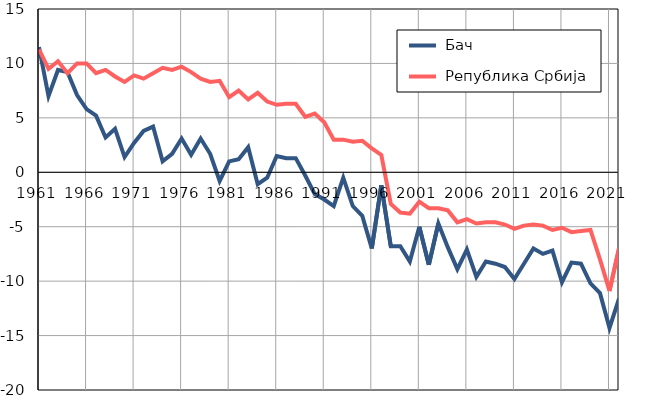
| Category |  Бач |  Република Србија |
|---|---|---|
| 1961.0 | 11.5 | 11.3 |
| 1962.0 | 7 | 9.5 |
| 1963.0 | 9.4 | 10.2 |
| 1964.0 | 9.2 | 9.1 |
| 1965.0 | 7.1 | 10 |
| 1966.0 | 5.8 | 10 |
| 1967.0 | 5.2 | 9.1 |
| 1968.0 | 3.2 | 9.4 |
| 1969.0 | 4 | 8.8 |
| 1970.0 | 1.4 | 8.3 |
| 1971.0 | 2.7 | 8.9 |
| 1972.0 | 3.8 | 8.6 |
| 1973.0 | 4.2 | 9.1 |
| 1974.0 | 1 | 9.6 |
| 1975.0 | 1.7 | 9.4 |
| 1976.0 | 3.1 | 9.7 |
| 1977.0 | 1.6 | 9.2 |
| 1978.0 | 3.1 | 8.6 |
| 1979.0 | 1.7 | 8.3 |
| 1980.0 | -0.8 | 8.4 |
| 1981.0 | 1 | 6.9 |
| 1982.0 | 1.2 | 7.5 |
| 1983.0 | 2.3 | 6.7 |
| 1984.0 | -1.1 | 7.3 |
| 1985.0 | -0.5 | 6.5 |
| 1986.0 | 1.5 | 6.2 |
| 1987.0 | 1.3 | 6.3 |
| 1988.0 | 1.3 | 6.3 |
| 1989.0 | -0.3 | 5.1 |
| 1990.0 | -2 | 5.4 |
| 1991.0 | -2.5 | 4.6 |
| 1992.0 | -3.1 | 3 |
| 1993.0 | -0.5 | 3 |
| 1994.0 | -3.1 | 2.8 |
| 1995.0 | -4 | 2.9 |
| 1996.0 | -7 | 2.2 |
| 1997.0 | -1.2 | 1.6 |
| 1998.0 | -6.8 | -2.9 |
| 1999.0 | -6.8 | -3.7 |
| 2000.0 | -8.2 | -3.8 |
| 2001.0 | -5 | -2.7 |
| 2002.0 | -8.5 | -3.3 |
| 2003.0 | -4.7 | -3.3 |
| 2004.0 | -6.9 | -3.5 |
| 2005.0 | -8.9 | -4.6 |
| 2006.0 | -7.1 | -4.3 |
| 2007.0 | -9.6 | -4.7 |
| 2008.0 | -8.2 | -4.6 |
| 2009.0 | -8.4 | -4.6 |
| 2010.0 | -8.7 | -4.8 |
| 2011.0 | -9.8 | -5.2 |
| 2012.0 | -8.4 | -4.9 |
| 2013.0 | -7 | -4.8 |
| 2014.0 | -7.5 | -4.9 |
| 2015.0 | -7.2 | -5.3 |
| 2016.0 | -10.1 | -5.1 |
| 2017.0 | -8.3 | -5.5 |
| 2018.0 | -8.4 | -5.4 |
| 2019.0 | -10.2 | -5.3 |
| 2020.0 | -11.1 | -8 |
| 2021.0 | -14.3 | -10.9 |
| 2022.0 | -11.6 | -7 |